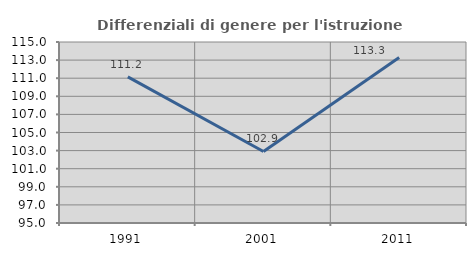
| Category | Differenziali di genere per l'istruzione superiore |
|---|---|
| 1991.0 | 111.152 |
| 2001.0 | 102.907 |
| 2011.0 | 113.291 |